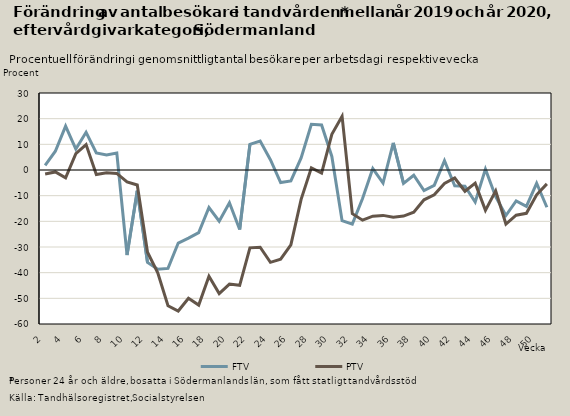
| Category | FTV | PTV |
|---|---|---|
| 2.0 | 1.794 | -1.569 |
| 3.0 | 7.317 | -0.759 |
| 4.0 | 17.072 | -3.021 |
| 5.0 | 8.153 | 6.353 |
| 6.0 | 14.683 | 9.893 |
| 7.0 | 6.635 | -1.79 |
| 8.0 | 5.834 | -1.054 |
| 9.0 | 6.608 | -1.317 |
| 10.0 | -33.156 | -4.675 |
| 11.0 | -8.118 | -5.844 |
| 12.0 | -36.015 | -32.043 |
| 13.0 | -38.691 | -40.088 |
| 14.0 | -38.343 | -52.884 |
| 15.0 | -28.454 | -54.959 |
| 16.0 | -26.53 | -49.979 |
| 17.0 | -24.419 | -52.624 |
| 18.0 | -14.613 | -41.372 |
| 19.0 | -19.958 | -48.138 |
| 20.0 | -12.741 | -44.427 |
| 21.0 | -23.178 | -44.934 |
| 22.0 | 9.978 | -30.342 |
| 23.0 | 11.262 | -30.097 |
| 24.0 | 4.011 | -35.982 |
| 25.0 | -4.87 | -34.719 |
| 26.0 | -4.246 | -29.165 |
| 27.0 | 4.706 | -11.449 |
| 28.0 | 17.776 | 0.826 |
| 29.0 | 17.526 | -1.174 |
| 30.0 | 5.276 | 13.896 |
| 31.0 | -19.72 | 20.957 |
| 32.0 | -21.076 | -17.039 |
| 33.0 | -11.132 | -19.558 |
| 34.0 | 0.536 | -18 |
| 35.0 | -5.078 | -17.684 |
| 36.0 | 10.613 | -18.402 |
| 37.0 | -5.239 | -17.937 |
| 38.0 | -2.032 | -16.464 |
| 39.0 | -7.994 | -11.61 |
| 40.0 | -5.983 | -9.66 |
| 41.0 | 3.608 | -5.261 |
| 42.0 | -6.137 | -3.131 |
| 43.0 | -6.338 | -8.289 |
| 44.0 | -12.466 | -5.11 |
| 45.0 | 0.344 | -15.727 |
| 46.0 | -10.4 | -8.144 |
| 47.0 | -17.741 | -21.048 |
| 48.0 | -12.082 | -17.609 |
| 49.0 | -14.177 | -16.871 |
| 50.0 | -5.172 | -9.678 |
| 51.0 | -14.516 | -5.399 |